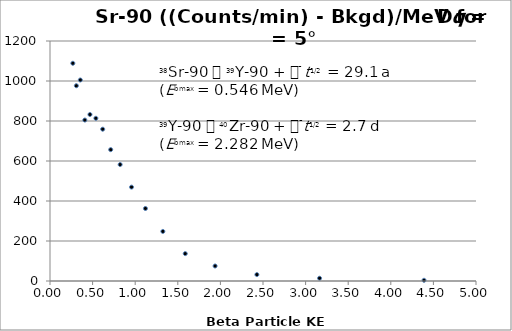
| Category | Series 0 |
|---|---|
| 0.2680227366322104 | 1088.589 |
| 0.309304754344384 | 976.362 |
| 0.35590877077319627 | 1005.007 |
| 0.4087613453094022 | 804.77 |
| 0.4690432505833301 | 832.512 |
| 0.5382797505768625 | 813.56 |
| 0.6184725682258746 | 759.033 |
| 0.7122978664250175 | 656.79 |
| 0.8234122552039224 | 582.245 |
| 0.9569424467790375 | 469.453 |
| 1.1203013982320613 | 362.536 |
| 1.3246166201445688 | 247.883 |
| 1.5873828179673266 | 136.951 |
| 1.937767254325585 | 75.038 |
| 2.4282816407744003 | 32.04 |
| 3.1639619838959154 | 13.773 |
| 4.3899082765526005 | 3.479 |